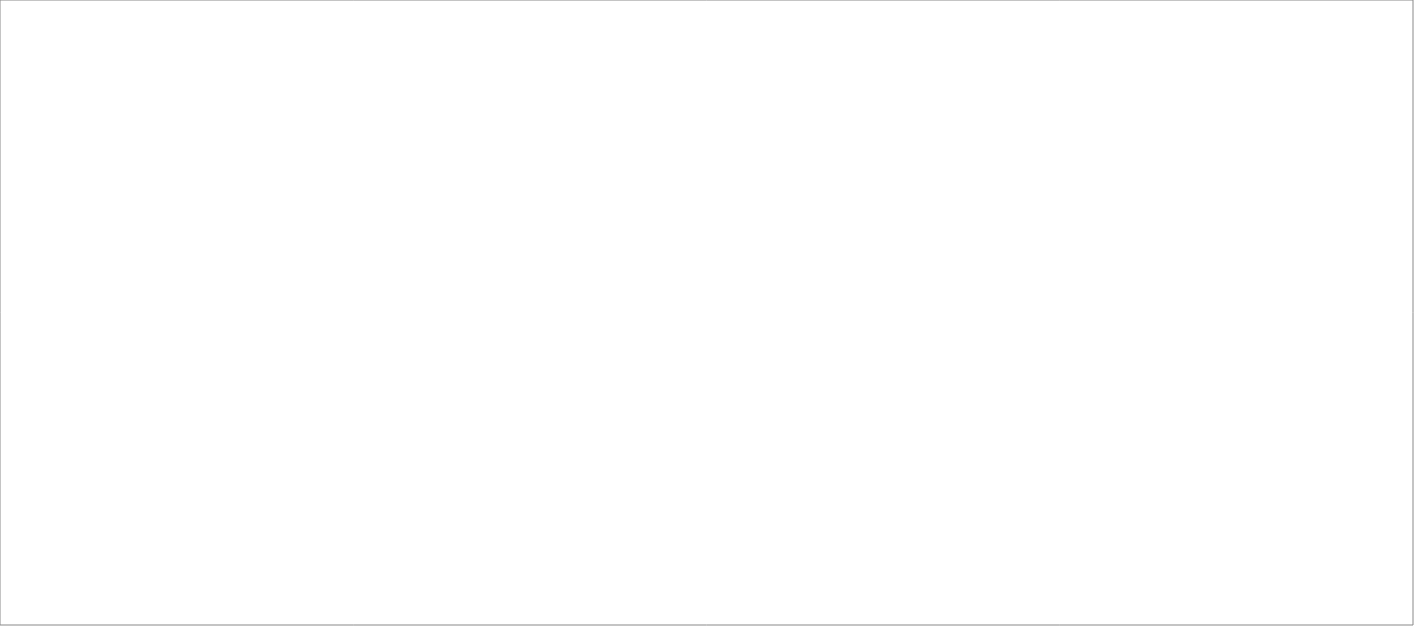
| Category | Total |
|---|---|
| Clockwork Bemanning & Rekrytering AB | 85 |
| Poolia Sverige AB | 85 |
| Randstad AB | 80 |
| Experis AB | 65 |
| Source Executive Recruitment Sweden AB | 25 |